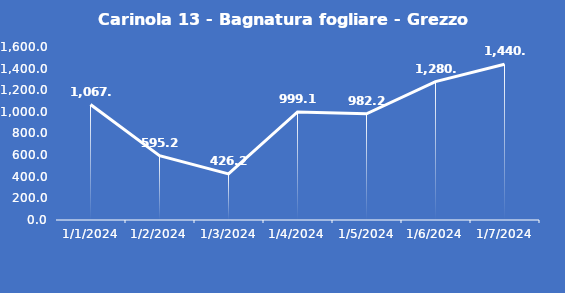
| Category | Carinola 13 - Bagnatura fogliare - Grezzo (min) |
|---|---|
| 1/1/24 | 1067.9 |
| 1/2/24 | 595.2 |
| 1/3/24 | 426.2 |
| 1/4/24 | 999.1 |
| 1/5/24 | 982.2 |
| 1/6/24 | 1280 |
| 1/7/24 | 1440 |